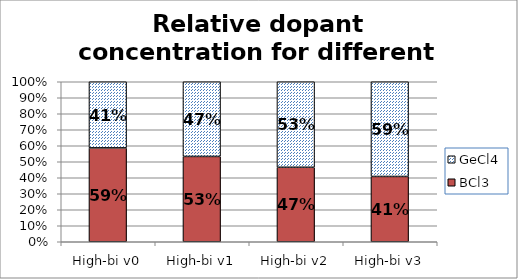
| Category | BCl3 | GeCl4 |
|---|---|---|
| High-bi v0 | 0.587 | 0.413 |
| High-bi v1 | 0.533 | 0.467 |
| High-bi v2 | 0.466 | 0.534 |
| High-bi v3 | 0.408 | 0.592 |